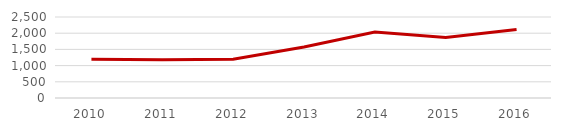
| Category | Recaudación de Ingresos Propios por Habitante  |
|---|---|
| 2010.0 | 1197.783 |
| 2011.0 | 1182.275 |
| 2012.0 | 1194.119 |
| 2013.0 | 1576.12 |
| 2014.0 | 2034.137 |
| 2015.0 | 1871.215 |
| 2016.0 | 2117.688 |